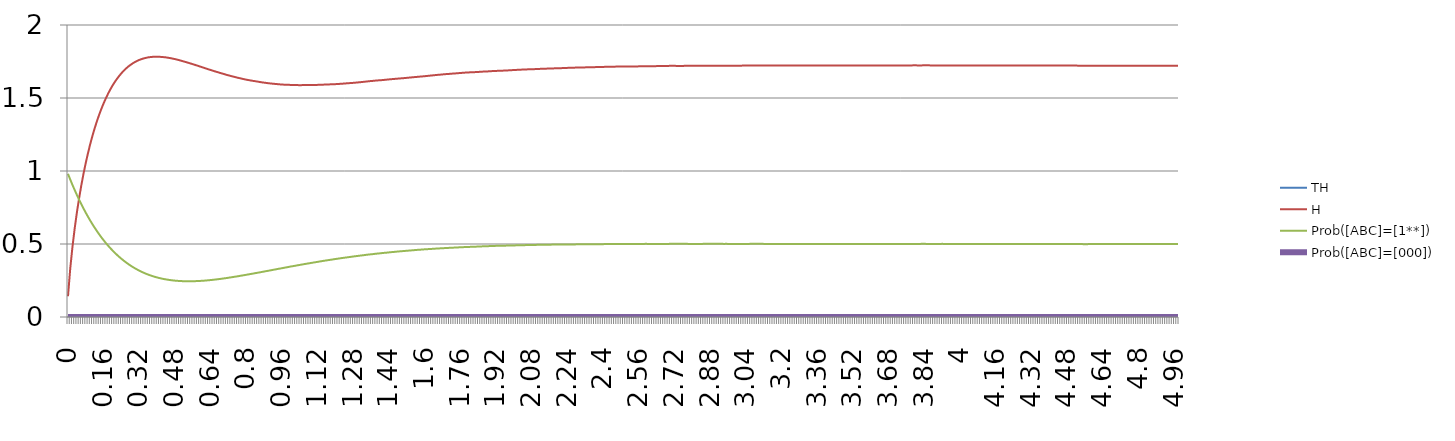
| Category | TH | H | Prob([ABC]=[1**]) | Prob([ABC]=[000]) |
|---|---|---|---|---|
| 0 | 0 | 0.142 | 0.98 | 0 |
| 0,01 | 0 | 0.332 | 0.942 | 0 |
| 0,02 | 0 | 0.48 | 0.905 | 0 |
| 0,03 | 0 | 0.607 | 0.87 | 0 |
| 0,04 | 0 | 0.718 | 0.836 | 0 |
| 0,05 | 0 | 0.816 | 0.803 | 0 |
| 0,06 | 0 | 0.904 | 0.772 | 0 |
| 0,07 | 0 | 0.985 | 0.742 | 0 |
| 0,08 | 0 | 1.058 | 0.713 | 0 |
| 0,09 | 0 | 1.125 | 0.686 | 0 |
| 0,1 | 0 | 1.186 | 0.66 | 0 |
| 0,11 | 0 | 1.243 | 0.634 | 0 |
| 0,12 | 0 | 1.295 | 0.61 | 0 |
| 0,13 | 0 | 1.343 | 0.588 | 0 |
| 0,14 | 0 | 1.387 | 0.566 | 0 |
| 0,15 | 0 | 1.427 | 0.545 | 0 |
| 0,16 | 0 | 1.465 | 0.525 | 0 |
| 0,17 | 0 | 1.499 | 0.506 | 0 |
| 0,18 | 0 | 1.531 | 0.488 | 0 |
| 0,19 | 0 | 1.56 | 0.471 | 0 |
| 0,2 | 0 | 1.586 | 0.455 | 0 |
| 0,21 | 0 | 1.61 | 0.44 | 0 |
| 0,22 | 0 | 1.632 | 0.425 | 0 |
| 0,23 | 0 | 1.652 | 0.411 | 0 |
| 0,24 | 0 | 1.671 | 0.398 | 0 |
| 0,25 | 0 | 1.687 | 0.386 | 0 |
| 0,26 | 0 | 1.702 | 0.374 | 0 |
| 0,27 | 0 | 1.715 | 0.363 | 0 |
| 0,28 | 0 | 1.727 | 0.353 | 0 |
| 0,29 | 0 | 1.737 | 0.343 | 0 |
| 0,3 | 0 | 1.746 | 0.334 | 0 |
| 0,31 | 0 | 1.754 | 0.325 | 0 |
| 0,32 | 0 | 1.761 | 0.317 | 0 |
| 0,33 | 0 | 1.767 | 0.31 | 0 |
| 0,34 | 0 | 1.772 | 0.303 | 0 |
| 0,35 | 0 | 1.775 | 0.296 | 0 |
| 0,36 | 0 | 1.778 | 0.29 | 0 |
| 0,37 | 0 | 1.78 | 0.285 | 0 |
| 0,38 | 0 | 1.782 | 0.28 | 0 |
| 0,39 | 0 | 1.782 | 0.275 | 0 |
| 0,4 | 0 | 1.783 | 0.271 | 0 |
| 0,41 | 0 | 1.782 | 0.267 | 0 |
| 0,42 | 0 | 1.781 | 0.263 | 0 |
| 0,43 | 0 | 1.78 | 0.26 | 0 |
| 0,44 | 0 | 1.778 | 0.257 | 0 |
| 0,45 | 0 | 1.775 | 0.255 | 0 |
| 0,46 | 0 | 1.773 | 0.252 | 0 |
| 0,47 | 0 | 1.77 | 0.251 | 0 |
| 0,48 | 0 | 1.766 | 0.249 | 0 |
| 0,49 | 0 | 1.762 | 0.248 | 0 |
| 0,5 | 0 | 1.758 | 0.247 | 0 |
| 0,51 | 0 | 1.754 | 0.246 | 0 |
| 0,52 | 0 | 1.75 | 0.245 | 0 |
| 0,53 | 0 | 1.745 | 0.245 | 0 |
| 0,54 | 0 | 1.741 | 0.245 | 0 |
| 0,55 | 0 | 1.736 | 0.245 | 0 |
| 0,56 | 0 | 1.731 | 0.245 | 0 |
| 0,57 | 0 | 1.726 | 0.246 | 0 |
| 0,58 | 0 | 1.722 | 0.246 | 0 |
| 0,59 | 0 | 1.716 | 0.247 | 0 |
| 0,6 | 0 | 1.711 | 0.248 | 0 |
| 0,61 | 0 | 1.706 | 0.249 | 0 |
| 0,62 | 0 | 1.702 | 0.25 | 0 |
| 0,63 | 0 | 1.696 | 0.252 | 0 |
| 0,64 | 0 | 1.692 | 0.253 | 0 |
| 0,65 | 0 | 1.686 | 0.255 | 0 |
| 0,66 | 0 | 1.682 | 0.257 | 0 |
| 0,67 | 0 | 1.677 | 0.258 | 0 |
| 0,68 | 0 | 1.673 | 0.26 | 0 |
| 0,69 | 0 | 1.668 | 0.262 | 0 |
| 0,7 | 0 | 1.664 | 0.265 | 0 |
| 0,71 | 0 | 1.659 | 0.267 | 0 |
| 0,72 | 0 | 1.655 | 0.269 | 0 |
| 0,73 | 0 | 1.651 | 0.272 | 0 |
| 0,74 | 0 | 1.647 | 0.274 | 0 |
| 0,75 | 0 | 1.643 | 0.276 | 0 |
| 0,76 | 0 | 1.639 | 0.279 | 0 |
| 0,77 | 0 | 1.636 | 0.282 | 0 |
| 0,78 | 0 | 1.632 | 0.284 | 0 |
| 0,79 | 0 | 1.628 | 0.287 | 0 |
| 0,8 | 0 | 1.625 | 0.289 | 0 |
| 0,81 | 0 | 1.622 | 0.292 | 0 |
| 0,82 | 0 | 1.62 | 0.295 | 0 |
| 0,83 | 0 | 1.617 | 0.298 | 0 |
| 0,84 | 0 | 1.615 | 0.3 | 0 |
| 0,85 | 0 | 1.612 | 0.303 | 0 |
| 0,86 | 0 | 1.61 | 0.306 | 0 |
| 0,87 | 0 | 1.607 | 0.309 | 0 |
| 0,88 | 0 | 1.605 | 0.312 | 0 |
| 0,89 | 0 | 1.603 | 0.315 | 0 |
| 0,9 | 0 | 1.601 | 0.317 | 0 |
| 0,91 | 0 | 1.599 | 0.32 | 0 |
| 0,92 | 0 | 1.598 | 0.323 | 0 |
| 0,93 | 0 | 1.596 | 0.326 | 0 |
| 0,94 | 0 | 1.595 | 0.329 | 0 |
| 0,95 | 0 | 1.593 | 0.332 | 0 |
| 0,96 | 0 | 1.592 | 0.334 | 0 |
| 0,97 | 0 | 1.591 | 0.338 | 0 |
| 0,98 | 0 | 1.59 | 0.34 | 0 |
| 0,99 | 0 | 1.59 | 0.343 | 0 |
| 1 | 0 | 1.59 | 0.346 | 0 |
| 1,01 | 0 | 1.589 | 0.349 | 0 |
| 1,02 | 0 | 1.588 | 0.352 | 0 |
| 1,03 | 0 | 1.588 | 0.354 | 0 |
| 1,04 | 0 | 1.588 | 0.357 | 0 |
| 1,05 | 0 | 1.588 | 0.36 | 0 |
| 1,06 | 0 | 1.588 | 0.362 | 0 |
| 1,07 | 0 | 1.588 | 0.365 | 0 |
| 1,08 | 0 | 1.589 | 0.368 | 0 |
| 1,09 | 0 | 1.589 | 0.37 | 0 |
| 1,1 | 0 | 1.59 | 0.373 | 0 |
| 1,11 | 0 | 1.59 | 0.375 | 0 |
| 1,12 | 0 | 1.59 | 0.378 | 0 |
| 1,13 | 0 | 1.59 | 0.381 | 0 |
| 1,14 | 0 | 1.591 | 0.383 | 0 |
| 1,15 | 0 | 1.592 | 0.386 | 0 |
| 1,16 | 0 | 1.592 | 0.388 | 0 |
| 1,17 | 0 | 1.593 | 0.39 | 0 |
| 1,18 | 0 | 1.594 | 0.393 | 0 |
| 1,19 | 0 | 1.595 | 0.395 | 0 |
| 1,2 | 0 | 1.595 | 0.398 | 0 |
| 1,21 | 0 | 1.596 | 0.4 | 0 |
| 1,22 | 0 | 1.597 | 0.402 | 0 |
| 1,23 | 0 | 1.598 | 0.404 | 0 |
| 1,24 | 0 | 1.599 | 0.406 | 0 |
| 1,25 | 0 | 1.601 | 0.408 | 0 |
| 1,26 | 0 | 1.602 | 0.41 | 0 |
| 1,27 | 0 | 1.603 | 0.412 | 0 |
| 1,28 | 0 | 1.604 | 0.415 | 0 |
| 1,29 | 0 | 1.605 | 0.417 | 0 |
| 1,3 | 0 | 1.607 | 0.419 | 0 |
| 1,31 | 0 | 1.608 | 0.421 | 0 |
| 1,32 | 0 | 1.61 | 0.422 | 0 |
| 1,33 | 0 | 1.612 | 0.424 | 0 |
| 1,34 | 0 | 1.613 | 0.426 | 0 |
| 1,35 | 0 | 1.615 | 0.428 | 0 |
| 1,36 | 0 | 1.616 | 0.43 | 0 |
| 1,37 | 0 | 1.618 | 0.431 | 0 |
| 1,38 | 0 | 1.62 | 0.433 | 0 |
| 1,39 | 0 | 1.621 | 0.435 | 0 |
| 1,4 | 0 | 1.622 | 0.436 | 0 |
| 1,41 | 0 | 1.623 | 0.438 | 0 |
| 1,42 | 0 | 1.624 | 0.44 | 0 |
| 1,43 | 0 | 1.626 | 0.441 | 0 |
| 1,44 | 0 | 1.628 | 0.443 | 0 |
| 1,45 | 0 | 1.629 | 0.444 | 0 |
| 1,46 | 0 | 1.63 | 0.446 | 0 |
| 1,47 | 0 | 1.632 | 0.447 | 0 |
| 1,48 | 0 | 1.633 | 0.449 | 0 |
| 1,49 | 0 | 1.634 | 0.45 | 0 |
| 1,5 | 0 | 1.635 | 0.451 | 0 |
| 1,51 | 0 | 1.637 | 0.452 | 0 |
| 1,52 | 0 | 1.638 | 0.454 | 0 |
| 1,53 | 0 | 1.64 | 0.455 | 0 |
| 1,54 | 0 | 1.641 | 0.456 | 0 |
| 1,55 | 0 | 1.643 | 0.458 | 0 |
| 1,56 | 0 | 1.644 | 0.459 | 0 |
| 1,57 | 0 | 1.645 | 0.46 | 0 |
| 1,58 | 0 | 1.647 | 0.461 | 0 |
| 1,59 | 0 | 1.648 | 0.463 | 0 |
| 1,6 | 0 | 1.65 | 0.464 | 0 |
| 1,61 | 0 | 1.651 | 0.465 | 0 |
| 1,62 | 0 | 1.653 | 0.465 | 0 |
| 1,63 | 0 | 1.654 | 0.466 | 0 |
| 1,64 | 0 | 1.656 | 0.468 | 0 |
| 1,65 | 0 | 1.658 | 0.469 | 0 |
| 1,66 | 0 | 1.659 | 0.47 | 0 |
| 1,67 | 0 | 1.66 | 0.47 | 0 |
| 1,68 | 0 | 1.662 | 0.471 | 0 |
| 1,69 | 0 | 1.663 | 0.472 | 0 |
| 1,7 | 0 | 1.664 | 0.473 | 0 |
| 1,71 | 0 | 1.665 | 0.474 | 0 |
| 1,72 | 0 | 1.667 | 0.474 | 0 |
| 1,73 | 0 | 1.668 | 0.475 | 0 |
| 1,74 | 0 | 1.669 | 0.476 | 0 |
| 1,75 | 0 | 1.67 | 0.477 | 0 |
| 1,76 | 0 | 1.671 | 0.478 | 0 |
| 1,77 | 0 | 1.673 | 0.478 | 0 |
| 1,78 | 0 | 1.674 | 0.479 | 0 |
| 1,79 | 0 | 1.675 | 0.48 | 0 |
| 1,8 | 0 | 1.676 | 0.48 | 0 |
| 1,81 | 0 | 1.676 | 0.481 | 0 |
| 1,82 | 0 | 1.677 | 0.481 | 0 |
| 1,83 | 0 | 1.678 | 0.482 | 0 |
| 1,84 | 0 | 1.679 | 0.483 | 0 |
| 1,85 | 0 | 1.68 | 0.483 | 0 |
| 1,86 | 0 | 1.681 | 0.484 | 0 |
| 1,87 | 0 | 1.681 | 0.484 | 0 |
| 1,88 | 0 | 1.682 | 0.485 | 0 |
| 1,89 | 0 | 1.683 | 0.486 | 0 |
| 1,9 | 0 | 1.684 | 0.486 | 0 |
| 1,91 | 0 | 1.685 | 0.487 | 0 |
| 1,92 | 0 | 1.686 | 0.487 | 0 |
| 1,93 | 0 | 1.686 | 0.488 | 0 |
| 1,94 | 0 | 1.687 | 0.488 | 0 |
| 1,95 | 0 | 1.687 | 0.488 | 0 |
| 1,96 | 0 | 1.688 | 0.489 | 0 |
| 1,97 | 0 | 1.689 | 0.489 | 0 |
| 1,98 | 0 | 1.69 | 0.49 | 0 |
| 1,99 | 0 | 1.691 | 0.49 | 0 |
| 2 | 0 | 1.692 | 0.49 | 0 |
| 2,01 | 0 | 1.692 | 0.491 | 0 |
| 2,02 | 0 | 1.693 | 0.491 | 0 |
| 2,03 | 0 | 1.694 | 0.492 | 0 |
| 2,04 | 0 | 1.695 | 0.492 | 0 |
| 2,05 | 0 | 1.696 | 0.492 | 0 |
| 2,06 | 0 | 1.696 | 0.493 | 0 |
| 2,07 | 0 | 1.697 | 0.493 | 0 |
| 2,08 | 0 | 1.697 | 0.493 | 0 |
| 2,09 | 0 | 1.698 | 0.494 | 0 |
| 2,1 | 0 | 1.698 | 0.494 | 0 |
| 2,11 | 0 | 1.699 | 0.494 | 0 |
| 2,12 | 0 | 1.7 | 0.495 | 0 |
| 2,13 | 0 | 1.7 | 0.495 | 0 |
| 2,14 | 0 | 1.701 | 0.495 | 0 |
| 2,15 | 0 | 1.701 | 0.495 | 0 |
| 2,16 | 0 | 1.702 | 0.496 | 0 |
| 2,17 | 0 | 1.702 | 0.496 | 0 |
| 2,18 | 0 | 1.703 | 0.496 | 0 |
| 2,19 | 0 | 1.704 | 0.496 | 0 |
| 2,2 | 0 | 1.704 | 0.497 | 0 |
| 2,21 | 0 | 1.704 | 0.497 | 0 |
| 2,22 | 0 | 1.705 | 0.497 | 0 |
| 2,23 | 0 | 1.706 | 0.497 | 0 |
| 2,24 | 0 | 1.706 | 0.497 | 0 |
| 2,25 | 0 | 1.707 | 0.497 | 0 |
| 2,26 | 0 | 1.707 | 0.497 | 0 |
| 2,27 | 0 | 1.708 | 0.497 | 0 |
| 2,28 | 0 | 1.708 | 0.498 | 0 |
| 2,29 | 0 | 1.709 | 0.498 | 0 |
| 2,3 | 0 | 1.709 | 0.498 | 0 |
| 2,31 | 0 | 1.71 | 0.498 | 0 |
| 2,32 | 0 | 1.71 | 0.498 | 0 |
| 2,33 | 0 | 1.71 | 0.498 | 0 |
| 2,34 | 0 | 1.71 | 0.499 | 0 |
| 2,35 | 0 | 1.711 | 0.499 | 0 |
| 2,36 | 0 | 1.711 | 0.499 | 0 |
| 2,37 | 0 | 1.712 | 0.499 | 0 |
| 2,38 | 0 | 1.712 | 0.499 | 0 |
| 2,39 | 0 | 1.713 | 0.499 | 0 |
| 2,4 | 0 | 1.713 | 0.499 | 0 |
| 2,41 | 0 | 1.713 | 0.499 | 0 |
| 2,42 | 0 | 1.714 | 0.499 | 0 |
| 2,43 | 0 | 1.714 | 0.5 | 0 |
| 2,44 | 0 | 1.714 | 0.5 | 0 |
| 2,45 | 0 | 1.715 | 0.5 | 0 |
| 2,46 | 0 | 1.715 | 0.5 | 0 |
| 2,47 | 0 | 1.715 | 0.5 | 0 |
| 2,48 | 0 | 1.715 | 0.5 | 0 |
| 2,49 | 0 | 1.716 | 0.5 | 0 |
| 2,5 | 0 | 1.716 | 0.5 | 0 |
| 2,51 | 0 | 1.716 | 0.5 | 0 |
| 2,52 | 0 | 1.716 | 0.5 | 0 |
| 2,53 | 0 | 1.716 | 0.5 | 0 |
| 2,54 | 0 | 1.716 | 0.5 | 0 |
| 2,55 | 0 | 1.716 | 0.5 | 0 |
| 2,56 | 0 | 1.717 | 0.501 | 0 |
| 2,57 | 0 | 1.717 | 0.501 | 0 |
| 2,58 | 0 | 1.717 | 0.501 | 0 |
| 2,59 | 0 | 1.718 | 0.501 | 0 |
| 2,6 | 0 | 1.718 | 0.501 | 0 |
| 2,61 | 0 | 1.718 | 0.501 | 0 |
| 2,62 | 0 | 1.718 | 0.5 | 0 |
| 2,63 | 0 | 1.718 | 0.5 | 0 |
| 2,64 | 0 | 1.718 | 0.5 | 0 |
| 2,65 | 0 | 1.719 | 0.5 | 0 |
| 2,66 | 0 | 1.719 | 0.5 | 0 |
| 2,67 | 0 | 1.72 | 0.5 | 0 |
| 2,68 | 0 | 1.72 | 0.501 | 0 |
| 2,69 | 0 | 1.72 | 0.501 | 0 |
| 2,7 | 0 | 1.72 | 0.501 | 0 |
| 2,71 | 0 | 1.72 | 0.501 | 0 |
| 2,72 | 0 | 1.72 | 0.501 | 0 |
| 2,73 | 0 | 1.72 | 0.502 | 0 |
| 2,74 | 0 | 1.72 | 0.502 | 0 |
| 2,75 | 0 | 1.72 | 0.502 | 0 |
| 2,76 | 0 | 1.72 | 0.501 | 0 |
| 2,77 | 0 | 1.72 | 0.501 | 0 |
| 2,78 | 0 | 1.721 | 0.501 | 0 |
| 2,79 | 0 | 1.721 | 0.501 | 0 |
| 2,8 | 0 | 1.721 | 0.501 | 0 |
| 2,81 | 0 | 1.72 | 0.501 | 0 |
| 2,82 | 0 | 1.72 | 0.501 | 0 |
| 2,83 | 0 | 1.72 | 0.501 | 0 |
| 2,84 | 0 | 1.72 | 0.501 | 0 |
| 2,85 | 0 | 1.721 | 0.501 | 0 |
| 2,86 | 0 | 1.721 | 0.501 | 0 |
| 2,87 | 0 | 1.721 | 0.501 | 0 |
| 2,88 | 0 | 1.721 | 0.501 | 0 |
| 2,89 | 0 | 1.721 | 0.501 | 0 |
| 2,9 | 0 | 1.722 | 0.501 | 0 |
| 2,91 | 0 | 1.722 | 0.501 | 0 |
| 2,92 | 0 | 1.722 | 0.501 | 0 |
| 2,93 | 0 | 1.722 | 0.501 | 0 |
| 2,94 | 0 | 1.721 | 0.501 | 0 |
| 2,95 | 0 | 1.721 | 0.501 | 0 |
| 2,96 | 0 | 1.721 | 0.501 | 0 |
| 2,97 | 0 | 1.721 | 0.501 | 0 |
| 2,98 | 0 | 1.721 | 0.5 | 0 |
| 2,99 | 0 | 1.721 | 0.5 | 0 |
| 3 | 0 | 1.721 | 0.5 | 0 |
| 3,01 | 0 | 1.721 | 0.5 | 0 |
| 3,02 | 0 | 1.722 | 0.5 | 0 |
| 3,03 | 0 | 1.722 | 0.5 | 0 |
| 3,04 | 0 | 1.722 | 0.5 | 0 |
| 3,05 | 0 | 1.722 | 0.501 | 0 |
| 3,06 | 0 | 1.722 | 0.501 | 0 |
| 3,07 | 0 | 1.722 | 0.501 | 0 |
| 3,08 | 0 | 1.722 | 0.501 | 0 |
| 3,09 | 0 | 1.722 | 0.501 | 0 |
| 3,1 | 0 | 1.722 | 0.501 | 0 |
| 3,11 | 0 | 1.722 | 0.501 | 0 |
| 3,12 | 0 | 1.722 | 0.501 | 0 |
| 3,13 | 0 | 1.723 | 0.501 | 0 |
| 3,14 | 0 | 1.723 | 0.5 | 0 |
| 3,15 | 0 | 1.722 | 0.5 | 0 |
| 3,16 | 0 | 1.722 | 0.5 | 0 |
| 3,17 | 0 | 1.722 | 0.5 | 0 |
| 3,18 | 0 | 1.722 | 0.5 | 0 |
| 3,19 | 0 | 1.722 | 0.5 | 0 |
| 3,2 | 0 | 1.722 | 0.5 | 0 |
| 3,21 | 0 | 1.722 | 0.5 | 0 |
| 3,22 | 0 | 1.722 | 0.5 | 0 |
| 3,23 | 0 | 1.722 | 0.5 | 0 |
| 3,24 | 0 | 1.722 | 0.5 | 0 |
| 3,25 | 0 | 1.722 | 0.5 | 0 |
| 3,26 | 0 | 1.722 | 0.5 | 0 |
| 3,27 | 0 | 1.722 | 0.5 | 0 |
| 3,28 | 0 | 1.722 | 0.5 | 0 |
| 3,29 | 0 | 1.722 | 0.5 | 0 |
| 3,3 | 0 | 1.722 | 0.5 | 0 |
| 3,31 | 0 | 1.722 | 0.5 | 0 |
| 3,32 | 0 | 1.722 | 0.5 | 0 |
| 3,33 | 0 | 1.722 | 0.5 | 0 |
| 3,34 | 0 | 1.722 | 0.5 | 0 |
| 3,35 | 0 | 1.723 | 0.5 | 0 |
| 3,36 | 0 | 1.723 | 0.5 | 0 |
| 3,37 | 0 | 1.722 | 0.5 | 0 |
| 3,38 | 0 | 1.722 | 0.499 | 0 |
| 3,39 | 0 | 1.722 | 0.499 | 0 |
| 3,4 | 0 | 1.722 | 0.499 | 0 |
| 3,41 | 0 | 1.722 | 0.5 | 0 |
| 3,42 | 0 | 1.722 | 0.499 | 0 |
| 3,43 | 0 | 1.723 | 0.5 | 0 |
| 3,44 | 0 | 1.723 | 0.5 | 0 |
| 3,45 | 0 | 1.723 | 0.5 | 0 |
| 3,46 | 0 | 1.723 | 0.5 | 0 |
| 3,47 | 0 | 1.723 | 0.5 | 0 |
| 3,48 | 0 | 1.722 | 0.5 | 0 |
| 3,49 | 0 | 1.722 | 0.5 | 0 |
| 3,5 | 0 | 1.722 | 0.5 | 0 |
| 3,51 | 0 | 1.722 | 0.5 | 0 |
| 3,52 | 0 | 1.723 | 0.5 | 0 |
| 3,53 | 0 | 1.723 | 0.5 | 0 |
| 3,54 | 0 | 1.722 | 0.5 | 0 |
| 3,55 | 0 | 1.723 | 0.5 | 0 |
| 3,56 | 0 | 1.723 | 0.5 | 0 |
| 3,57 | 0 | 1.723 | 0.5 | 0 |
| 3,58 | 0 | 1.723 | 0.5 | 0 |
| 3,59 | 0 | 1.723 | 0.5 | 0 |
| 3,6 | 0 | 1.722 | 0.5 | 0 |
| 3,61 | 0 | 1.722 | 0.5 | 0 |
| 3,62 | 0 | 1.722 | 0.5 | 0 |
| 3,63 | 0 | 1.722 | 0.5 | 0 |
| 3,64 | 0 | 1.722 | 0.5 | 0 |
| 3,65 | 0 | 1.722 | 0.5 | 0 |
| 3,66 | 0 | 1.722 | 0.5 | 0 |
| 3,67 | 0 | 1.722 | 0.5 | 0 |
| 3,68 | 0 | 1.723 | 0.5 | 0 |
| 3,69 | 0 | 1.723 | 0.5 | 0 |
| 3,7 | 0 | 1.723 | 0.5 | 0 |
| 3,71 | 0 | 1.723 | 0.5 | 0 |
| 3,72 | 0 | 1.723 | 0.5 | 0 |
| 3,73 | 0 | 1.723 | 0.5 | 0 |
| 3,74 | 0 | 1.723 | 0.5 | 0 |
| 3,75 | 0 | 1.723 | 0.5 | 0 |
| 3,76 | 0 | 1.723 | 0.5 | 0 |
| 3,77 | 0 | 1.723 | 0.5 | 0 |
| 3,78 | 0 | 1.723 | 0.5 | 0 |
| 3,79 | 0 | 1.724 | 0.5 | 0 |
| 3,8 | 0 | 1.724 | 0.501 | 0 |
| 3,81 | 0 | 1.723 | 0.501 | 0 |
| 3,82 | 0 | 1.723 | 0.501 | 0 |
| 3,83 | 0 | 1.724 | 0.501 | 0 |
| 3,84 | 0 | 1.724 | 0.501 | 0 |
| 3,85 | 0 | 1.724 | 0.501 | 0 |
| 3,86 | 0 | 1.724 | 0.501 | 0 |
| 3,87 | 0 | 1.723 | 0.501 | 0 |
| 3,88 | 0 | 1.723 | 0.501 | 0 |
| 3,89 | 0 | 1.723 | 0.501 | 0 |
| 3,9 | 0 | 1.723 | 0.501 | 0 |
| 3,91 | 0 | 1.723 | 0.501 | 0 |
| 3,92 | 0 | 1.723 | 0.501 | 0 |
| 3,93 | 0 | 1.722 | 0.501 | 0 |
| 3,94 | 0 | 1.722 | 0.5 | 0 |
| 3,95 | 0 | 1.722 | 0.5 | 0 |
| 3,96 | 0 | 1.722 | 0.5 | 0 |
| 3,97 | 0 | 1.722 | 0.5 | 0 |
| 3,98 | 0 | 1.722 | 0.5 | 0 |
| 3,99 | 0 | 1.722 | 0.5 | 0 |
| 4 | 0 | 1.722 | 0.5 | 0 |
| 4,01 | 0 | 1.722 | 0.5 | 0 |
| 4,02 | 0 | 1.722 | 0.5 | 0 |
| 4,03 | 0 | 1.722 | 0.5 | 0 |
| 4,04 | 0 | 1.722 | 0.5 | 0 |
| 4,05 | 0 | 1.722 | 0.5 | 0 |
| 4,06 | 0 | 1.722 | 0.5 | 0 |
| 4,07 | 0 | 1.722 | 0.5 | 0 |
| 4,08 | 0 | 1.722 | 0.5 | 0 |
| 4,09 | 0 | 1.723 | 0.5 | 0 |
| 4,1 | 0 | 1.723 | 0.5 | 0 |
| 4,11 | 0 | 1.723 | 0.5 | 0 |
| 4,12 | 0 | 1.723 | 0.5 | 0 |
| 4,13 | 0 | 1.723 | 0.5 | 0 |
| 4,14 | 0 | 1.723 | 0.5 | 0 |
| 4,15 | 0 | 1.722 | 0.5 | 0 |
| 4,16 | 0 | 1.722 | 0.5 | 0 |
| 4,17 | 0 | 1.723 | 0.5 | 0 |
| 4,18 | 0 | 1.723 | 0.5 | 0 |
| 4,19 | 0 | 1.723 | 0.5 | 0 |
| 4,2 | 0 | 1.723 | 0.5 | 0 |
| 4,21 | 0 | 1.723 | 0.5 | 0 |
| 4,22 | 0 | 1.723 | 0.5 | 0 |
| 4,23 | 0 | 1.723 | 0.5 | 0 |
| 4,24 | 0 | 1.723 | 0.5 | 0 |
| 4,25 | 0 | 1.723 | 0.5 | 0 |
| 4,26 | 0 | 1.723 | 0.5 | 0 |
| 4,27 | 0 | 1.723 | 0.5 | 0 |
| 4,28 | 0 | 1.723 | 0.5 | 0 |
| 4,29 | 0 | 1.723 | 0.5 | 0 |
| 4,3 | 0 | 1.723 | 0.5 | 0 |
| 4,31 | 0 | 1.723 | 0.5 | 0 |
| 4,32 | 0 | 1.723 | 0.5 | 0 |
| 4,33 | 0 | 1.723 | 0.5 | 0 |
| 4,34 | 0 | 1.722 | 0.5 | 0 |
| 4,35 | 0 | 1.722 | 0.5 | 0 |
| 4,36 | 0 | 1.722 | 0.5 | 0 |
| 4,37 | 0 | 1.722 | 0.499 | 0 |
| 4,38 | 0 | 1.722 | 0.499 | 0 |
| 4,39 | 0 | 1.722 | 0.499 | 0 |
| 4,4 | 0 | 1.722 | 0.499 | 0 |
| 4,41 | 0 | 1.722 | 0.499 | 0 |
| 4,42 | 0 | 1.722 | 0.499 | 0 |
| 4,43 | 0 | 1.723 | 0.499 | 0 |
| 4,44 | 0 | 1.722 | 0.499 | 0 |
| 4,45 | 0 | 1.722 | 0.5 | 0 |
| 4,46 | 0 | 1.722 | 0.5 | 0 |
| 4,47 | 0 | 1.722 | 0.5 | 0 |
| 4,48 | 0 | 1.722 | 0.5 | 0 |
| 4,49 | 0 | 1.722 | 0.499 | 0 |
| 4,5 | 0 | 1.722 | 0.499 | 0 |
| 4,51 | 0 | 1.722 | 0.499 | 0 |
| 4,52 | 0 | 1.722 | 0.499 | 0 |
| 4,53 | 0 | 1.721 | 0.499 | 0 |
| 4,54 | 0 | 1.721 | 0.499 | 0 |
| 4,55 | 0 | 1.721 | 0.499 | 0 |
| 4,56 | 0 | 1.721 | 0.499 | 0 |
| 4,57 | 0 | 1.721 | 0.499 | 0 |
| 4,58 | 0 | 1.721 | 0.499 | 0 |
| 4,59 | 0 | 1.721 | 0.499 | 0 |
| 4,6 | 0 | 1.721 | 0.499 | 0 |
| 4,61 | 0 | 1.721 | 0.499 | 0 |
| 4,62 | 0 | 1.721 | 0.499 | 0 |
| 4,63 | 0 | 1.721 | 0.5 | 0 |
| 4,64 | 0 | 1.721 | 0.5 | 0 |
| 4,65 | 0 | 1.721 | 0.5 | 0 |
| 4,66 | 0 | 1.721 | 0.5 | 0 |
| 4,67 | 0 | 1.721 | 0.5 | 0 |
| 4,68 | 0 | 1.721 | 0.5 | 0 |
| 4,69 | 0 | 1.721 | 0.5 | 0 |
| 4,7 | 0 | 1.721 | 0.5 | 0 |
| 4,71 | 0 | 1.721 | 0.5 | 0 |
| 4,72 | 0 | 1.721 | 0.5 | 0 |
| 4,73 | 0 | 1.721 | 0.5 | 0 |
| 4,74 | 0 | 1.721 | 0.5 | 0 |
| 4,75 | 0 | 1.721 | 0.5 | 0 |
| 4,76 | 0 | 1.721 | 0.5 | 0 |
| 4,77 | 0 | 1.721 | 0.5 | 0 |
| 4,78 | 0 | 1.721 | 0.5 | 0 |
| 4,79 | 0 | 1.721 | 0.5 | 0 |
| 4,8 | 0 | 1.722 | 0.5 | 0 |
| 4,81 | 0 | 1.722 | 0.5 | 0 |
| 4,82 | 0 | 1.721 | 0.5 | 0 |
| 4,83 | 0 | 1.721 | 0.5 | 0 |
| 4,84 | 0 | 1.72 | 0.5 | 0 |
| 4,85 | 0 | 1.72 | 0.5 | 0 |
| 4,86 | 0 | 1.72 | 0.5 | 0 |
| 4,87 | 0 | 1.721 | 0.5 | 0 |
| 4,88 | 0 | 1.721 | 0.5 | 0 |
| 4,89 | 0 | 1.72 | 0.5 | 0 |
| 4,9 | 0 | 1.721 | 0.5 | 0 |
| 4,91 | 0 | 1.721 | 0.5 | 0 |
| 4,92 | 0 | 1.721 | 0.501 | 0 |
| 4,93 | 0 | 1.721 | 0.501 | 0 |
| 4,94 | 0 | 1.721 | 0.501 | 0 |
| 4,95 | 0 | 1.721 | 0.501 | 0 |
| 4,96 | 0 | 1.721 | 0.501 | 0 |
| 4,97 | 0 | 1.721 | 0.5 | 0 |
| 4,98 | 0 | 1.721 | 0.5 | 0 |